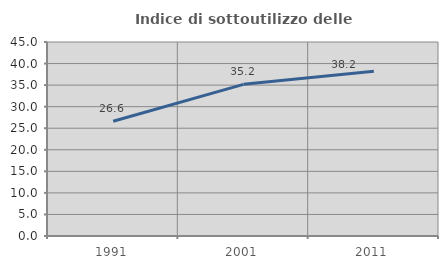
| Category | Indice di sottoutilizzo delle abitazioni  |
|---|---|
| 1991.0 | 26.621 |
| 2001.0 | 35.179 |
| 2011.0 | 38.214 |